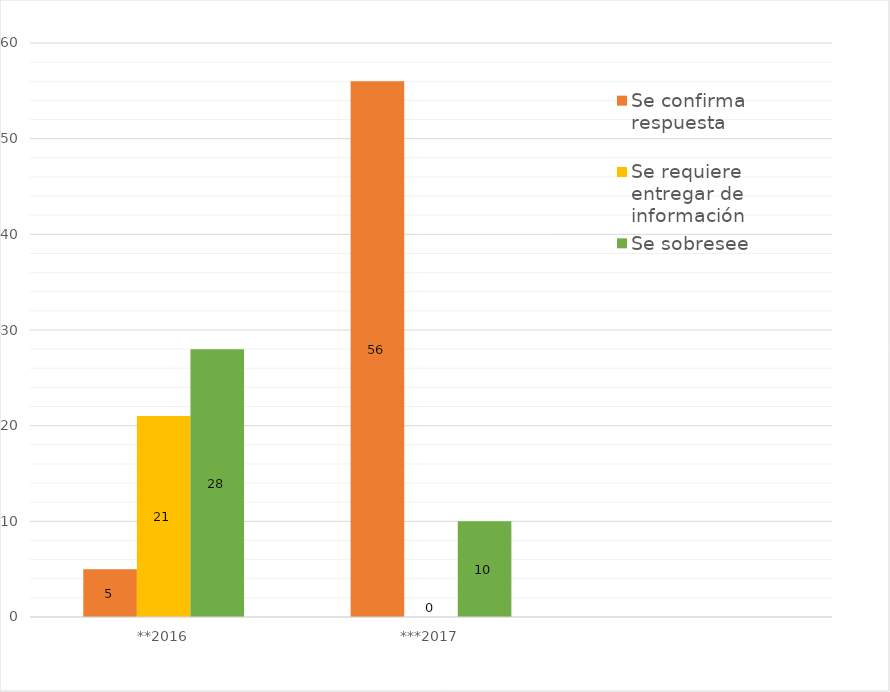
| Category | Se confirma respuesta | Se requiere entregar de información  | Se sobresee  |
|---|---|---|---|
| **2016 | 5 | 21 | 28 |
| ***2017 | 56 | 0 | 10 |